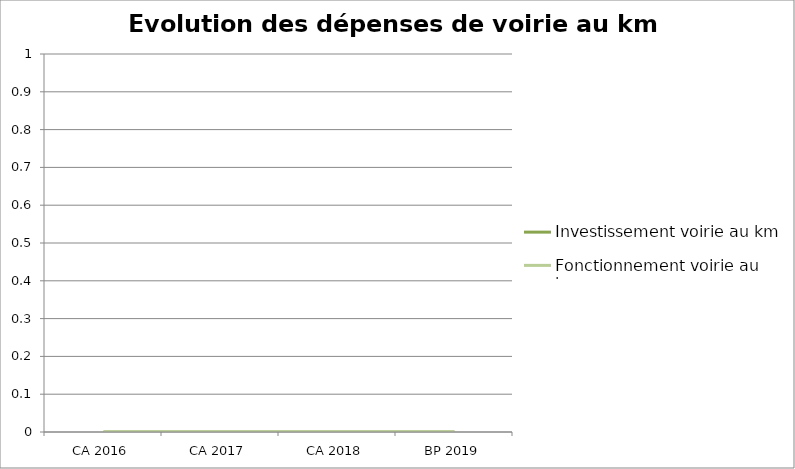
| Category | Investissement voirie au km | Fonctionnement voirie au km |
|---|---|---|
| CA 2016 | 0 | 0 |
| CA 2017 | 0 | 0 |
| CA 2018 | 0 | 0 |
| BP 2019 | 0 | 0 |